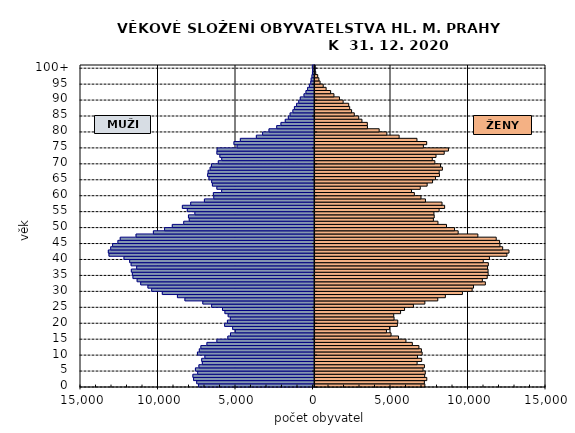
| Category | MUŽI | ŽENY |
|---|---|---|
| 0 | -7382 | 7184 |
| 1 | -7502 | 7153 |
| 2 | -7704 | 7309 |
| 3 | -7749 | 7173 |
| 4 | -7439 | 7211 |
| 5 | -7585 | 7067 |
| 6 | -7360 | 7157 |
| 7 | -7140 | 6684 |
| 8 | -7181 | 6980 |
| 9 | -6974 | 6712 |
| 10 | -7455 | 7009 |
| 11 | -7334 | 6963 |
| 12 | -7233 | 6801 |
| 13 | -6843 | 6377 |
| 14 | -6200 | 5963 |
| 15 | -5494 | 5486 |
| 16 | -5324 | 5004 |
| 17 | -5010 | 4706 |
| 18 | -5184 | 4906 |
| 19 | -5703 | 5411 |
| 20 | -5522 | 5436 |
| 21 | -5333 | 5197 |
| 22 | -5473 | 5176 |
| 23 | -5683 | 5618 |
| 24 | -5839 | 5875 |
| 25 | -6540 | 6447 |
| 26 | -7109 | 7185 |
| 27 | -8263 | 8018 |
| 28 | -8746 | 8507 |
| 29 | -9722 | 9607 |
| 30 | -10408 | 10234 |
| 31 | -10650 | 10324 |
| 32 | -11115 | 11087 |
| 33 | -11346 | 10893 |
| 34 | -11615 | 11208 |
| 35 | -11654 | 11267 |
| 36 | -11719 | 11263 |
| 37 | -11375 | 11229 |
| 38 | -11734 | 11280 |
| 39 | -11829 | 10953 |
| 40 | -12193 | 11349 |
| 41 | -13163 | 12478 |
| 42 | -13204 | 12612 |
| 43 | -13052 | 12205 |
| 44 | -12930 | 12029 |
| 45 | -12586 | 12007 |
| 46 | -12437 | 11788 |
| 47 | -11416 | 10603 |
| 48 | -10297 | 9333 |
| 49 | -9575 | 9099 |
| 50 | -9078 | 8581 |
| 51 | -8340 | 8030 |
| 52 | -7984 | 7734 |
| 53 | -8035 | 7788 |
| 54 | -7620 | 7769 |
| 55 | -8108 | 8105 |
| 56 | -8428 | 8460 |
| 57 | -7890 | 8292 |
| 58 | -7006 | 7223 |
| 59 | -6401 | 6934 |
| 60 | -6427 | 6507 |
| 61 | -5892 | 6324 |
| 62 | -6202 | 6889 |
| 63 | -6489 | 7332 |
| 64 | -6537 | 7681 |
| 65 | -6713 | 7869 |
| 66 | -6799 | 8127 |
| 67 | -6764 | 8109 |
| 68 | -6637 | 8316 |
| 69 | -6552 | 8196 |
| 70 | -6109 | 7828 |
| 71 | -5887 | 7663 |
| 72 | -6009 | 7905 |
| 73 | -6199 | 8433 |
| 74 | -6186 | 8707 |
| 75 | -4899 | 7090 |
| 76 | -5100 | 7303 |
| 77 | -4687 | 6675 |
| 78 | -3654 | 5525 |
| 79 | -3252 | 4732 |
| 80 | -2839 | 4237 |
| 81 | -2341 | 3479 |
| 82 | -2067 | 3472 |
| 83 | -1789 | 3124 |
| 84 | -1590 | 2918 |
| 85 | -1477 | 2631 |
| 86 | -1298 | 2458 |
| 87 | -1199 | 2335 |
| 88 | -1059 | 2272 |
| 89 | -920 | 1912 |
| 90 | -820 | 1676 |
| 91 | -580 | 1318 |
| 92 | -454 | 1105 |
| 93 | -348 | 814 |
| 94 | -232 | 627 |
| 95 | -145 | 424 |
| 96 | -118 | 346 |
| 97 | -67 | 271 |
| 98 | -36 | 144 |
| 99 | -25 | 91 |
| 100+ | -42 | 86 |